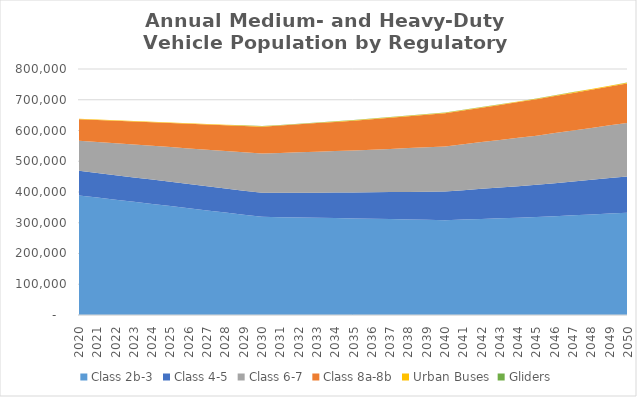
| Category | Class 2b-3 | Class 4-5 | Class 6-7 | Class 8a-8b | Urban Buses | Gliders |
|---|---|---|---|---|---|---|
| 2020.0 | 388850 | 80260 | 97530 | 70060 | 1140 | 630 |
| 2021.0 | 381890 | 80020 | 100590 | 71750 | 1150 | 640 |
| 2022.0 | 374940 | 79790 | 103650 | 73430 | 1170 | 650 |
| 2023.0 | 367980 | 79550 | 106710 | 75120 | 1180 | 660 |
| 2024.0 | 361030 | 79320 | 109770 | 76800 | 1200 | 670 |
| 2025.0 | 354070 | 79080 | 112830 | 78490 | 1210 | 680 |
| 2026.0 | 347110 | 78840 | 115890 | 80180 | 1220 | 690 |
| 2027.0 | 340150 | 78600 | 118950 | 81870 | 1240 | 700 |
| 2028.0 | 333200 | 78370 | 122020 | 83550 | 1250 | 700 |
| 2029.0 | 326240 | 78130 | 125080 | 85240 | 1270 | 710 |
| 2030.0 | 319280 | 77890 | 128140 | 86930 | 1280 | 720 |
| 2031.0 | 318240 | 79170 | 129800 | 88940 | 1310 | 720 |
| 2032.0 | 317200 | 80450 | 131470 | 90950 | 1340 | 730 |
| 2033.0 | 316170 | 81740 | 133130 | 92970 | 1360 | 730 |
| 2034.0 | 315130 | 83020 | 134800 | 94980 | 1390 | 740 |
| 2035.0 | 314090 | 84300 | 136460 | 96990 | 1420 | 740 |
| 2036.0 | 312970 | 86090 | 138480 | 99100 | 1450 | 740 |
| 2037.0 | 311860 | 87880 | 140500 | 101210 | 1480 | 740 |
| 2038.0 | 310740 | 89660 | 142520 | 103320 | 1520 | 730 |
| 2039.0 | 309630 | 91450 | 144540 | 105430 | 1550 | 730 |
| 2040.0 | 308510 | 93240 | 146560 | 107540 | 1580 | 730 |
| 2041.0 | 310540 | 95510 | 149240 | 109660 | 1610 | 730 |
| 2042.0 | 312580 | 97780 | 151920 | 111790 | 1640 | 720 |
| 2043.0 | 314610 | 100050 | 154610 | 113910 | 1660 | 720 |
| 2044.0 | 316650 | 102320 | 157290 | 116040 | 1690 | 710 |
| 2045.0 | 318680 | 104590 | 159970 | 118160 | 1720 | 710 |
| 2046.0 | 321500 | 107290 | 162830 | 120260 | 1750 | 700 |
| 2047.0 | 324330 | 109980 | 165690 | 122350 | 1780 | 690 |
| 2048.0 | 327150 | 112680 | 168550 | 124450 | 1810 | 690 |
| 2049.0 | 329980 | 115370 | 171410 | 126540 | 1840 | 680 |
| 2050.0 | 332800 | 118070 | 174270 | 128640 | 1870 | 670 |